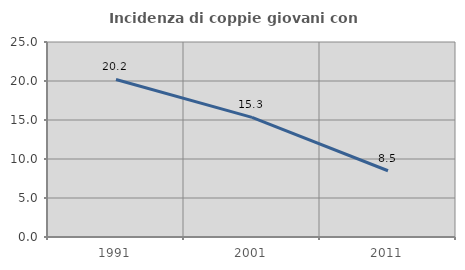
| Category | Incidenza di coppie giovani con figli |
|---|---|
| 1991.0 | 20.199 |
| 2001.0 | 15.33 |
| 2011.0 | 8.493 |